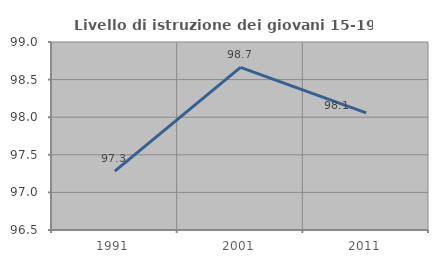
| Category | Livello di istruzione dei giovani 15-19 anni |
|---|---|
| 1991.0 | 97.284 |
| 2001.0 | 98.662 |
| 2011.0 | 98.058 |